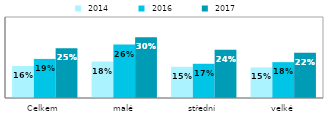
| Category |  2014 |  2016 |  2017 |
|---|---|---|---|
| Celkem | 0.158 | 0.193 | 0.246 |
| malé | 0.18 | 0.264 | 0.3 |
| střední | 0.154 | 0.169 | 0.238 |
| velké | 0.151 | 0.177 | 0.224 |